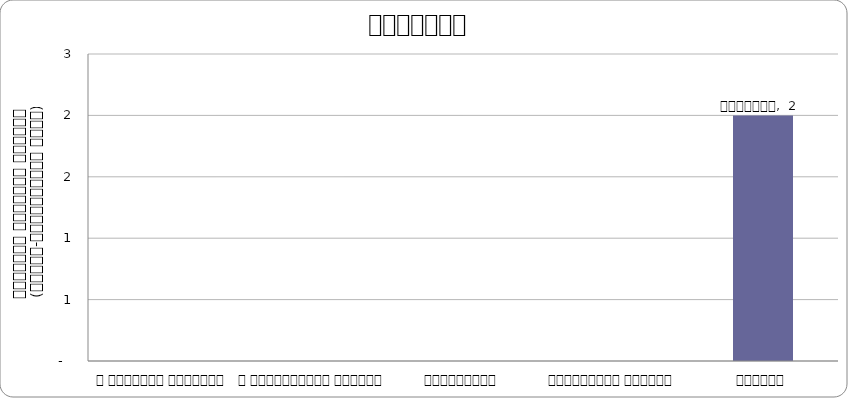
| Category | वातावरण |
|---|---|
| द हिमालयन टाइम्स् | 0 |
| द काठमाण्डौं पोस्ट् | 0 |
| कान्तिपुर | 0 |
| अन्नपूर्ण पोस्ट् | 0 |
| नागरिक | 2 |